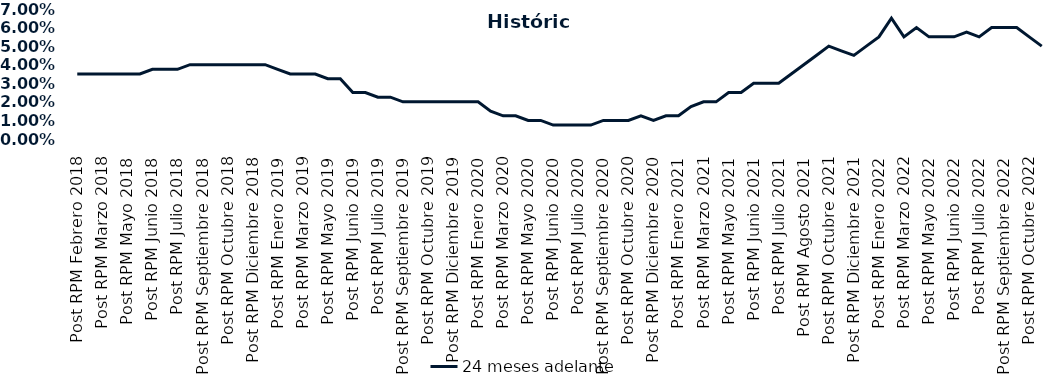
| Category | 24 meses adelante  |
|---|---|
| Post RPM Febrero 2018 | 0.035 |
| Pre RPM Marzo 2018 | 0.035 |
| Post RPM Marzo 2018 | 0.035 |
| Pre RPM Mayo 2018 | 0.035 |
| Post RPM Mayo 2018 | 0.035 |
| Pre RPM Junio 2018 | 0.035 |
| Post RPM Junio 2018 | 0.038 |
| Pre RPM Julio 2018 | 0.038 |
| Post RPM Julio 2018 | 0.038 |
| Pre RPM Septiembre 2018 | 0.04 |
| Post RPM Septiembre 2018 | 0.04 |
| Pre RPM Octubre 2018 | 0.04 |
| Post RPM Octubre 2018 | 0.04 |
| Pre RPM Diciembre 2018 | 0.04 |
| Post RPM Diciembre 2018 | 0.04 |
| Pre RPM Enero 2019 | 0.04 |
| Post RPM Enero 2019 | 0.038 |
| Pre RPM Marzo 2019 | 0.035 |
| Post RPM Marzo 2019 | 0.035 |
| Pre RPM Mayo 2019 | 0.035 |
| Post RPM Mayo 2019 | 0.032 |
| Pre RPM Junio 2019 | 0.032 |
| Post RPM Junio 2019 | 0.025 |
| Pre RPM Julio 2019 | 0.025 |
| Post RPM Julio 2019 | 0.022 |
| Pre RPM Septiembre 2019 | 0.022 |
| Post RPM Septiembre 2019 | 0.02 |
| Pre RPM Octubre 2019 | 0.02 |
| Post RPM Octubre 2019 | 0.02 |
| Pre RPM Diciembre 2019 | 0.02 |
| Post RPM Diciembre 2019 | 0.02 |
| Pre RPM Enero 2020 | 0.02 |
| Post RPM Enero 2020 | 0.02 |
| Pre RPM Marzo 2020 | 0.015 |
| Post RPM Marzo 2020 | 0.012 |
| Pre RPM Mayo 2020 | 0.012 |
| Post RPM Mayo 2020 | 0.01 |
| Pre RPM Junio 2020 | 0.01 |
| Post RPM Junio 2020 | 0.008 |
| Pre RPM Julio 2020 | 0.008 |
| Post RPM Julio 2020 | 0.008 |
| Pre RPM Septiembre 2020 | 0.008 |
| Post RPM Septiembre 2020 | 0.01 |
| Pre RPM Octubre 2020 | 0.01 |
| Post RPM Octubre 2020 | 0.01 |
| Pre RPM Diciembre 2020 | 0.012 |
| Post RPM Diciembre 2020 | 0.01 |
| Pre RPM Enero 2021 | 0.012 |
| Post RPM Enero 2021 | 0.012 |
| Pre RPM Marzo 2021 | 0.018 |
| Post RPM Marzo 2021 | 0.02 |
| Pre RPM Mayo 2021 | 0.02 |
| Post RPM Mayo 2021 | 0.025 |
| Pre RPM Junio 2021 | 0.025 |
| Post RPM Junio 2021 | 0.03 |
| Pre RPM Julio 2021 | 0.03 |
| Post RPM Julio 2021 | 0.03 |
| Pre RPM Agosto 2021 | 0.035 |
| Post RPM Agosto 2021 | 0.04 |
| Pre RPM Octubre 2021 | 0.045 |
| Post RPM Octubre 2021 | 0.05 |
| Pre RPM Diciembre 2021 | 0.048 |
| Post RPM Diciembre 2021 | 0.045 |
| Pre RPM Enero 2022 | 0.05 |
| Post RPM Enero 2022 | 0.055 |
| Pre RPM Marzo 2022 | 0.065 |
| Post RPM Marzo 2022 | 0.055 |
| Pre RPM Mayo 2022 | 0.06 |
| Post RPM Mayo 2022 | 0.055 |
| Pre RPM Junio 2022 | 0.055 |
| Post RPM Junio 2022 | 0.055 |
| Pre RPM Julio 2022 | 0.058 |
| Post RPM Julio 2022 | 0.055 |
| Pre RPM Septiembre 2022 | 0.06 |
| Post RPM Septiembre 2022 | 0.06 |
| Pre RPM Octubre 2022 | 0.06 |
| Post RPM Octubre 2022 | 0.055 |
| Pre RPM Diciembre 2022 | 0.05 |